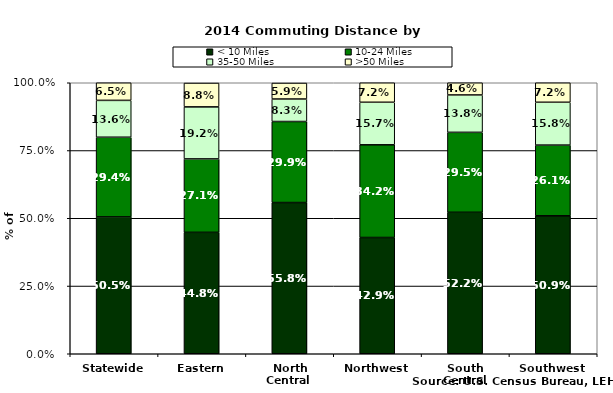
| Category | < 10 Miles | 10-24 Miles | 35-50 Miles | >50 Miles |
|---|---|---|---|---|
| Statewide | 0.505 | 0.294 | 0.136 | 0.065 |
| Eastern | 0.448 | 0.271 | 0.192 | 0.088 |
| North Central  | 0.558 | 0.299 | 0.083 | 0.059 |
| Northwest | 0.429 | 0.342 | 0.157 | 0.072 |
| South Central | 0.522 | 0.295 | 0.138 | 0.046 |
| Southwest | 0.509 | 0.261 | 0.158 | 0.072 |